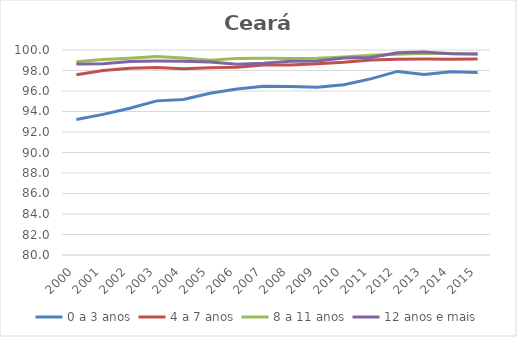
| Category | 0 a 3 anos | 4 a 7 anos | 8 a 11 anos | 12 anos e mais |
|---|---|---|---|---|
| 2000.0 | 93.221 | 97.592 | 98.846 | 98.633 |
| 2001.0 | 93.72 | 98.009 | 99.062 | 98.66 |
| 2002.0 | 94.314 | 98.22 | 99.191 | 98.874 |
| 2003.0 | 95.037 | 98.295 | 99.376 | 98.915 |
| 2004.0 | 95.165 | 98.178 | 99.224 | 98.904 |
| 2005.0 | 95.787 | 98.262 | 99.002 | 98.832 |
| 2006.0 | 96.2 | 98.322 | 99.183 | 98.619 |
| 2007.0 | 96.463 | 98.535 | 99.188 | 98.703 |
| 2008.0 | 96.446 | 98.549 | 99.181 | 98.908 |
| 2009.0 | 96.358 | 98.666 | 99.197 | 98.928 |
| 2010.0 | 96.617 | 98.815 | 99.317 | 99.229 |
| 2011.0 | 97.179 | 99.023 | 99.49 | 99.268 |
| 2012.0 | 97.91 | 99.101 | 99.586 | 99.721 |
| 2013.0 | 97.618 | 99.129 | 99.685 | 99.806 |
| 2014.0 | 97.883 | 99.102 | 99.649 | 99.635 |
| 2015.0 | 97.812 | 99.116 | 99.617 | 99.618 |